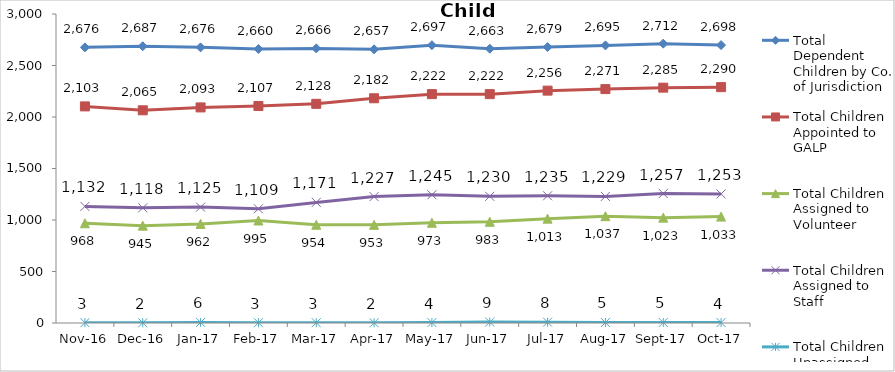
| Category | Total Dependent Children by Co. of Jurisdiction | Total Children Appointed to GALP | Total Children Assigned to Volunteer | Total Children Assigned to Staff | Total Children Unassigned |
|---|---|---|---|---|---|
| 2016-11-01 | 2676 | 2103 | 968 | 1132 | 3 |
| 2016-12-01 | 2687 | 2065 | 945 | 1118 | 2 |
| 2017-01-01 | 2676 | 2093 | 962 | 1125 | 6 |
| 2017-02-01 | 2660 | 2107 | 995 | 1109 | 3 |
| 2017-03-01 | 2666 | 2128 | 954 | 1171 | 3 |
| 2017-04-01 | 2657 | 2182 | 953 | 1227 | 2 |
| 2017-05-01 | 2697 | 2222 | 973 | 1245 | 4 |
| 2017-06-01 | 2663 | 2222 | 983 | 1230 | 9 |
| 2017-07-01 | 2679 | 2256 | 1013 | 1235 | 8 |
| 2017-08-01 | 2695 | 2271 | 1037 | 1229 | 5 |
| 2017-09-01 | 2712 | 2285 | 1023 | 1257 | 5 |
| 2017-10-01 | 2698 | 2290 | 1033 | 1253 | 4 |